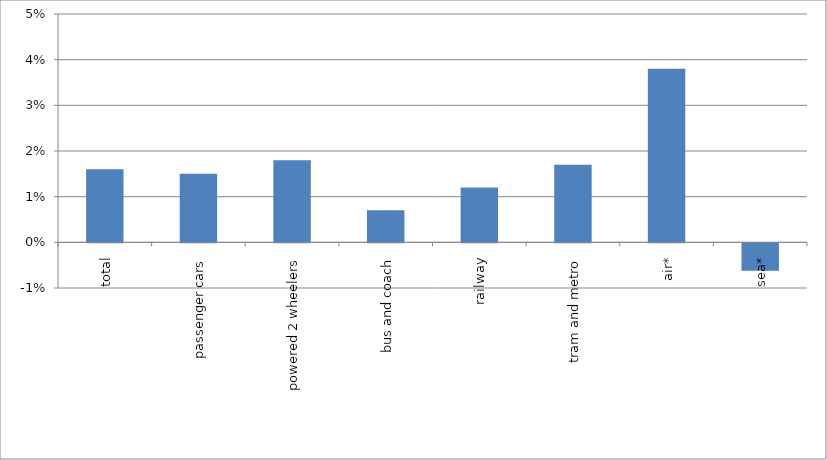
| Category | Series 0 |
|---|---|
| total | 0.016 |
| passenger cars | 0.015 |
| powered 2 wheelers | 0.018 |
| bus and coach | 0.007 |
| railway | 0.012 |
| tram and metro | 0.017 |
| air* | 0.038 |
| sea* | -0.006 |